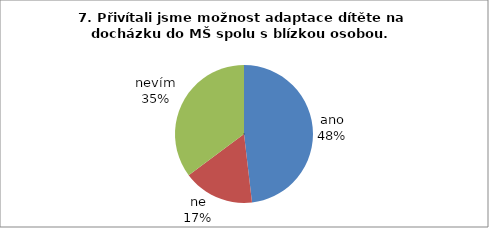
| Category | 7. |
|---|---|
| ano | 26 |
| ne | 9 |
| nevím | 19 |